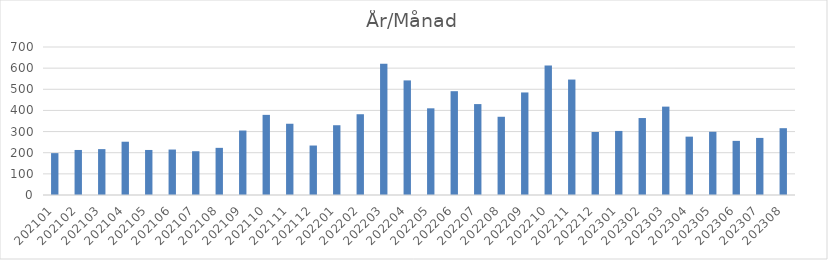
| Category | Summa |
|---|---|
| 202101 | 198 |
| 202102 | 213 |
| 202103 | 217 |
| 202104 | 252 |
| 202105 | 213 |
| 202106 | 215 |
| 202107 | 207 |
| 202108 | 223 |
| 202109 | 305 |
| 202110 | 379 |
| 202111 | 337 |
| 202112 | 234 |
| 202201 | 330 |
| 202202 | 382 |
| 202203 | 621 |
| 202204 | 542 |
| 202205 | 410 |
| 202206 | 491 |
| 202207 | 430 |
| 202208 | 370 |
| 202209 | 485 |
| 202210 | 612 |
| 202211 | 546 |
| 202212 | 298 |
| 202301 | 303 |
| 202302 | 364 |
| 202303 | 418 |
| 202304 | 276 |
| 202305 | 299 |
| 202306 | 256 |
| 202307 | 270 |
| 202308 | 316 |